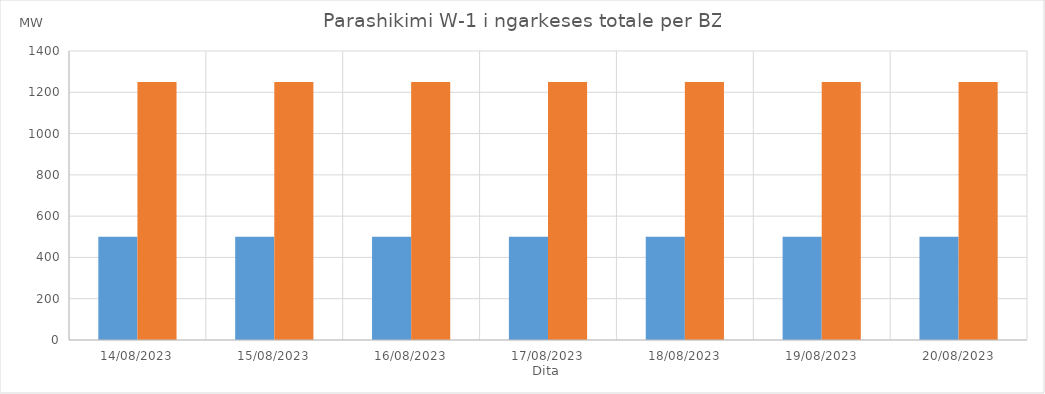
| Category | Min (MW) | Max (MW) |
|---|---|---|
| 14/08/2023 | 500 | 1250 |
| 15/08/2023 | 500 | 1250 |
| 16/08/2023 | 500 | 1250 |
| 17/08/2023 | 500 | 1250 |
| 18/08/2023 | 500 | 1250 |
| 19/08/2023 | 500 | 1250 |
| 20/08/2023 | 500 | 1250 |